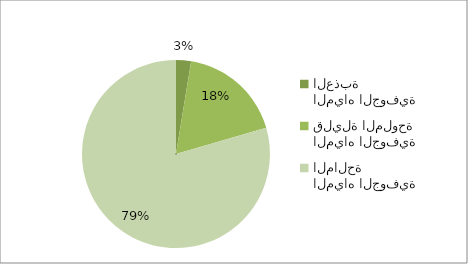
| Category | المياه الجوفية العذبة المياه الجوفية قليلة الملوحة المياه الجوفية المالحة |
|---|---|
| المياه الجوفية العذبة | 16420 |
| المياه الجوفية قليلة الملوحة | 114000 |
| المياه الجوفية المالحة | 506200 |